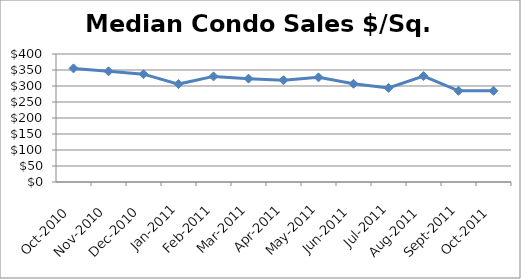
| Category | Series 0 |
|---|---|
| 2010-10-01 | 355 |
| 2010-11-01 | 346 |
| 2010-12-01 | 337 |
| 2011-01-01 | 306 |
| 2011-02-01 | 330 |
| 2011-03-01 | 323 |
| 2011-04-01 | 318 |
| 2011-05-01 | 327 |
| 2011-06-01 | 307 |
| 2011-07-01 | 294 |
| 2011-08-01 | 331 |
| 2011-09-01 | 285 |
| 2011-10-01 | 285 |